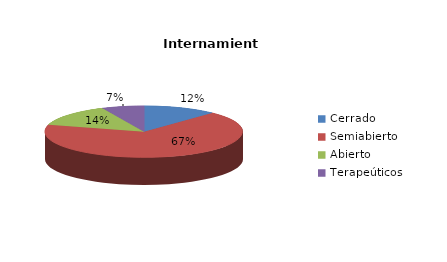
| Category | Series 0 |
|---|---|
| Cerrado | 7 |
| Semiabierto | 39 |
| Abierto | 8 |
| Terapeúticos | 4 |